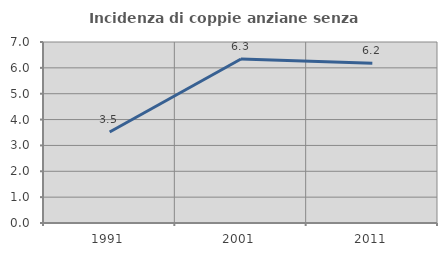
| Category | Incidenza di coppie anziane senza figli  |
|---|---|
| 1991.0 | 3.521 |
| 2001.0 | 6.345 |
| 2011.0 | 6.174 |